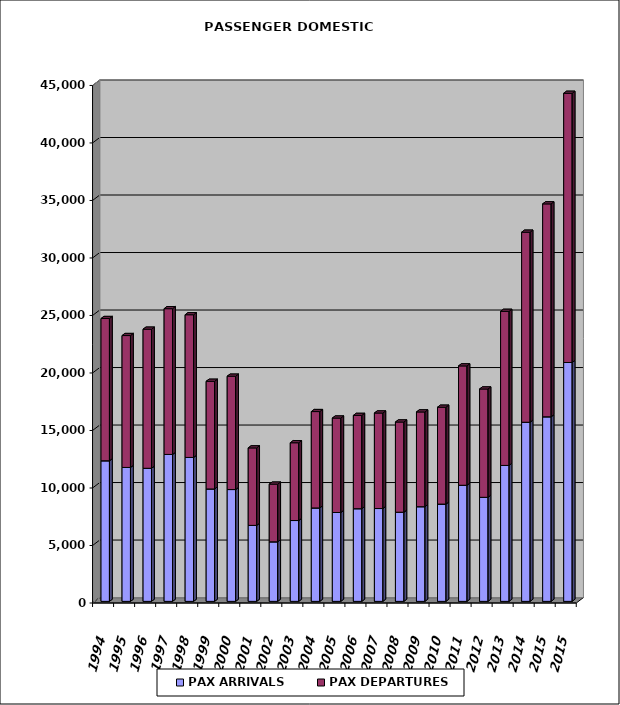
| Category | PAX ARRIVALS | PAX DEPARTURES |
|---|---|---|
| 1994.0 | 12224 | 12368 |
| 1995.0 | 11644 | 11468 |
| 1996.0 | 11571 | 12093 |
| 1997.0 | 12774 | 12674 |
| 1998.0 | 12514 | 12407 |
| 1999.0 | 9775 | 9359 |
| 2000.0 | 9723 | 9854 |
| 2001.0 | 6607 | 6736 |
| 2002.0 | 5177 | 5015 |
| 2003.0 | 7029 | 6762 |
| 2004.0 | 8124 | 8378 |
| 2005.0 | 7728 | 8210 |
| 2006.0 | 8057 | 8111 |
| 2007.0 | 8072 | 8305 |
| 2008.0 | 7752 | 7843 |
| 2009.0 | 8231 | 8239 |
| 2010.0 | 8458 | 8422 |
| 2011.0 | 10095 | 10378 |
| 2012.0 | 9046 | 9419 |
| 2013.0 | 11819 | 13397 |
| 2014.0 | 15575 | 16522 |
| 2015.0 | 16048 | 18512 |
| 2015.0 | 20768 | 23406 |